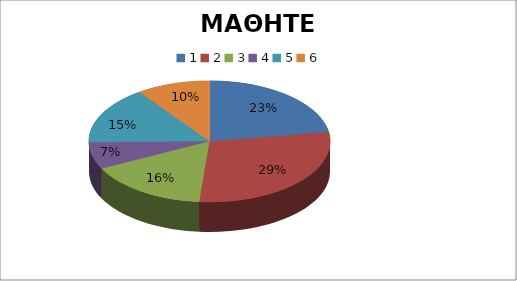
| Category | ΜΑΘΗΤΕΣ | ΔΕΚΑΤΙΑΝΟ |
|---|---|---|
| 0 | 25 | 0 |
| 1 | 32 | 0 |
| 2 | 18 | 0 |
| 3 | 8 | 0 |
| 4 | 17 | 0 |
| 5 | 11 | 0 |